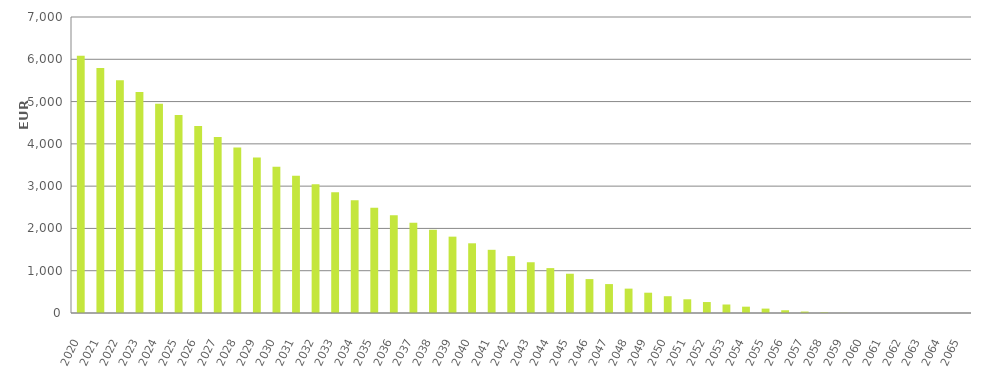
| Category | EUR Millions |
|---|---|
| 2020.0 | 6082503161.39 |
| 2021.0 | 5792205458.112 |
| 2022.0 | 5505980740.494 |
| 2023.0 | 5225391448.252 |
| 2024.0 | 4951127324.793 |
| 2025.0 | 4682473665.692 |
| 2026.0 | 4419380387.342 |
| 2027.0 | 4162486013.159 |
| 2028.0 | 3914139285.201 |
| 2029.0 | 3679080827.32 |
| 2030.0 | 3456325850.916 |
| 2031.0 | 3244798486.768 |
| 2032.0 | 3044678500.459 |
| 2033.0 | 2853324212.254 |
| 2034.0 | 2668672647.971 |
| 2035.0 | 2488133795.535 |
| 2036.0 | 2309810787.817 |
| 2037.0 | 2136322139.104 |
| 2038.0 | 1968238120.545 |
| 2039.0 | 1805526795.849 |
| 2040.0 | 1648302267.16 |
| 2041.0 | 1494357563.803 |
| 2042.0 | 1345027087.024 |
| 2043.0 | 1200228504.081 |
| 2044.0 | 1061524534.183 |
| 2045.0 | 928474237.166 |
| 2046.0 | 801741025.927 |
| 2047.0 | 683902758.956 |
| 2048.0 | 576214591.624 |
| 2049.0 | 480050156.633 |
| 2050.0 | 396686187.585 |
| 2051.0 | 324144675.297 |
| 2052.0 | 259234450.179 |
| 2053.0 | 200997601.876 |
| 2054.0 | 149459831.209 |
| 2055.0 | 104118431.609 |
| 2056.0 | 65232910.225 |
| 2057.0 | 34274210.964 |
| 2058.0 | 13505115.049 |
| 2059.0 | 3065094.491 |
| 2060.0 | 236392.301 |
| 2061.0 | 51998.177 |
| 2062.0 | 13093.035 |
| 2063.0 | 1273.937 |
| 2064.0 | 0 |
| 2065.0 | 0 |